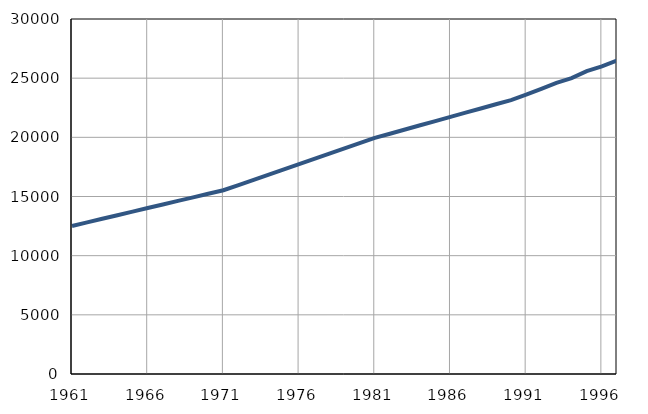
| Category | Population
size |
|---|---|
| 1961.0 | 12513 |
| 1962.0 | 12815 |
| 1963.0 | 13117 |
| 1964.0 | 13419 |
| 1965.0 | 13721 |
| 1966.0 | 14023 |
| 1967.0 | 14325 |
| 1968.0 | 14627 |
| 1969.0 | 14929 |
| 1970.0 | 15231 |
| 1971.0 | 15528 |
| 1972.0 | 15970 |
| 1973.0 | 16412 |
| 1974.0 | 16854 |
| 1975.0 | 17296 |
| 1976.0 | 17738 |
| 1977.0 | 18180 |
| 1978.0 | 18622 |
| 1979.0 | 19064 |
| 1980.0 | 19506 |
| 1981.0 | 19952 |
| 1982.0 | 20307 |
| 1983.0 | 20662 |
| 1984.0 | 21017 |
| 1985.0 | 21372 |
| 1986.0 | 21727 |
| 1987.0 | 22082 |
| 1988.0 | 22437 |
| 1989.0 | 22792 |
| 1990.0 | 23147 |
| 1991.0 | 23600 |
| 1992.0 | 24100 |
| 1993.0 | 24600 |
| 1994.0 | 25000 |
| 1995.0 | 25600 |
| 1996.0 | 26000 |
| 1997.0 | 26500 |